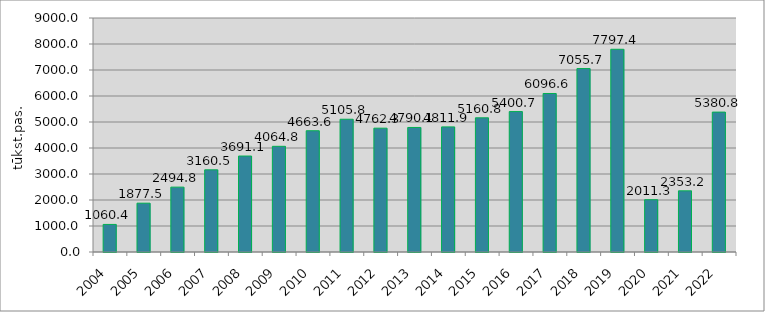
| Category | Series 0 |
|---|---|
| 2004.0 | 1060.384 |
| 2005.0 | 1877.461 |
| 2006.0 | 2494.835 |
| 2007.0 | 3160.535 |
| 2008.0 | 3691.099 |
| 2009.0 | 4064.755 |
| 2010.0 | 4663.647 |
| 2011.0 | 5105.818 |
| 2012.0 | 4762.335 |
| 2013.0 | 4790.136 |
| 2014.0 | 4811.949 |
| 2015.0 | 5160.759 |
| 2016.0 | 5400.709 |
| 2017.0 | 6096.62 |
| 2018.0 | 7055.734 |
| 2019.0 | 7797.4 |
| 2020.0 | 2011.3 |
| 2021.0 | 2353.2 |
| 2022.0 | 5380.8 |